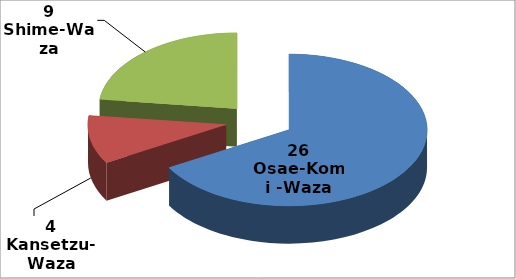
| Category | Series 0 |
|---|---|
| 0 | 26 |
| 1 | 4 |
| 2 | 9 |